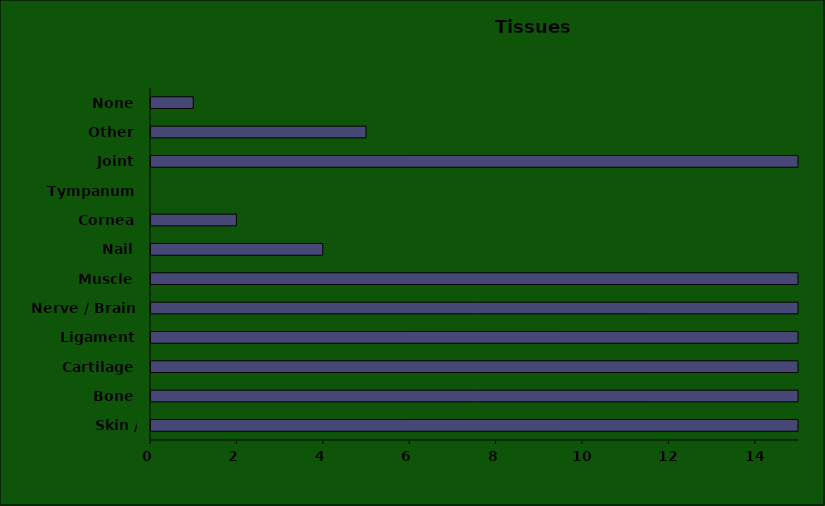
| Category | Series 0 |
|---|---|
| Skin / Subcutis | 79 |
| Bone | 58 |
| Cartilage | 19 |
| Ligament | 323 |
| Nerve / Brain | 57 |
| Muscle | 78 |
| Nail | 4 |
| Cornea | 2 |
| Tympanum | 0 |
| Joint | 43 |
| Other | 5 |
| None | 1 |